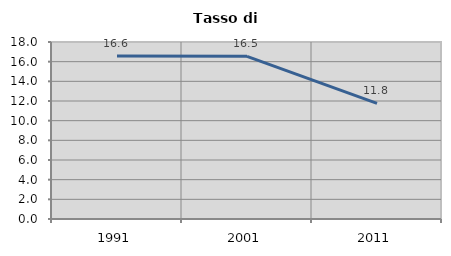
| Category | Tasso di disoccupazione   |
|---|---|
| 1991.0 | 16.571 |
| 2001.0 | 16.547 |
| 2011.0 | 11.765 |